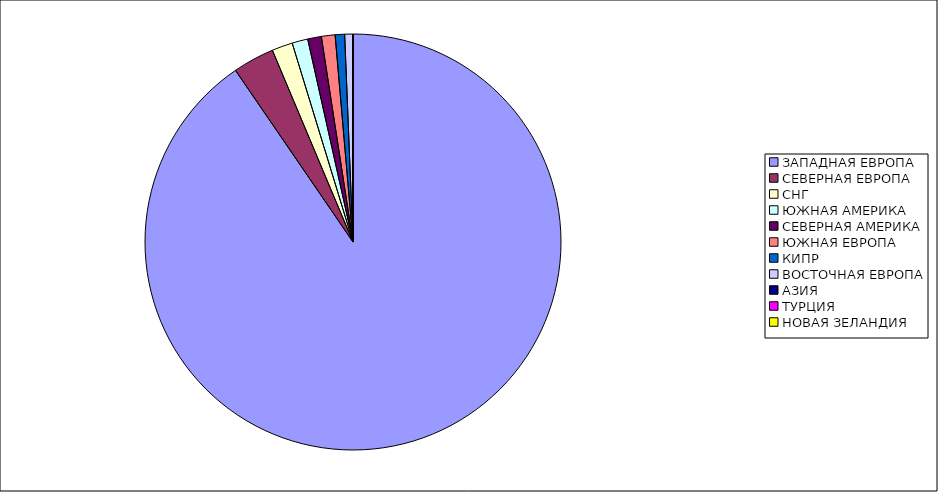
| Category | Оборот |
|---|---|
| ЗАПАДНАЯ ЕВРОПА | 0.904 |
| СЕВЕРНАЯ ЕВРОПА | 0.032 |
| СНГ | 0.016 |
| ЮЖНАЯ АМЕРИКА | 0.012 |
| СЕВЕРНАЯ АМЕРИКА | 0.011 |
| ЮЖНАЯ ЕВРОПА | 0.011 |
| КИПР | 0.007 |
| ВОСТОЧНАЯ ЕВРОПА | 0.006 |
| АЗИЯ | 0 |
| ТУРЦИЯ | 0 |
| НОВАЯ ЗЕЛАНДИЯ | 0 |